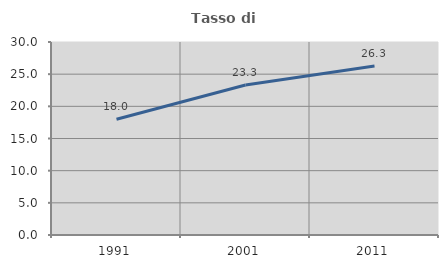
| Category | Tasso di occupazione   |
|---|---|
| 1991.0 | 17.992 |
| 2001.0 | 23.31 |
| 2011.0 | 26.257 |